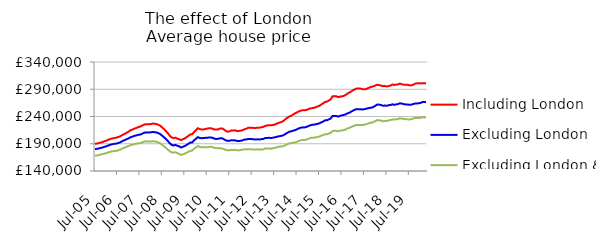
| Category | Including London | Excluding London | Excluding London & SE |
|---|---|---|---|
| 2005-07-01 | 190099.846 | 180338.943 | 168115.943 |
| 2005-08-01 | 190409.416 | 180707.116 | 168387.745 |
| 2005-09-01 | 191025.705 | 181294.079 | 169165.237 |
| 2005-10-01 | 192128.229 | 182260.003 | 170136.846 |
| 2005-11-01 | 193022.749 | 183020.557 | 170802.395 |
| 2005-12-01 | 194589.472 | 184321.051 | 171890.78 |
| 2006-01-01 | 195561.889 | 185223.855 | 172601.05 |
| 2006-02-01 | 197180.233 | 186694.526 | 173973.307 |
| 2006-03-01 | 198290.018 | 187883.534 | 175074.67 |
| 2006-04-01 | 199521.21 | 188954.872 | 175987.174 |
| 2006-05-01 | 200291.878 | 189620.06 | 176437.969 |
| 2006-06-01 | 200874.24 | 190048.53 | 176847.591 |
| 2006-07-01 | 201753.772 | 190830.896 | 177451.803 |
| 2006-08-01 | 202945.476 | 191932.237 | 178625.067 |
| 2006-09-01 | 204665.909 | 193486.107 | 180029.257 |
| 2006-10-01 | 206669.853 | 195431.198 | 181917.714 |
| 2006-11-01 | 208271.992 | 196704.296 | 182996.889 |
| 2006-12-01 | 210431.706 | 198484.218 | 184628.33 |
| 2007-01-01 | 212236.573 | 199867.99 | 185753.039 |
| 2007-02-01 | 214691.924 | 201953.448 | 187491.53 |
| 2007-03-01 | 215960.598 | 202950.014 | 188129.855 |
| 2007-04-01 | 217668.208 | 204390.327 | 189305.612 |
| 2007-05-01 | 218745.526 | 205176.529 | 190051.523 |
| 2007-06-01 | 220436.757 | 206350.676 | 190766.928 |
| 2007-07-01 | 221128.98 | 206601.586 | 190934.336 |
| 2007-08-01 | 222903.284 | 208023.687 | 191970.933 |
| 2007-09-01 | 224639.27 | 209648.69 | 193488.751 |
| 2007-10-01 | 225909.983 | 210886.574 | 194554.085 |
| 2007-11-01 | 225637.65 | 210701.658 | 194139.319 |
| 2007-12-01 | 225795.991 | 210808.016 | 194100.151 |
| 2008-01-01 | 226230.744 | 210997.948 | 193849.067 |
| 2008-02-01 | 227150.677 | 211685.752 | 194629.825 |
| 2008-03-01 | 226536.237 | 211131.036 | 194027.854 |
| 2008-04-01 | 226088.749 | 210687.499 | 193735.581 |
| 2008-05-01 | 224583.894 | 209243.33 | 192031.653 |
| 2008-06-01 | 222870.934 | 207605.676 | 190599.84 |
| 2008-07-01 | 219624.904 | 204552.197 | 187738.181 |
| 2008-08-01 | 216697.269 | 201783.679 | 185273.991 |
| 2008-09-01 | 213087.292 | 198550.708 | 182220.184 |
| 2008-10-01 | 209193.305 | 194954.131 | 179292.765 |
| 2008-11-01 | 204692.274 | 190946.059 | 176189.96 |
| 2008-12-01 | 201599.231 | 187849.92 | 174117.242 |
| 2009-01-01 | 200403.32 | 186878.072 | 173689.928 |
| 2009-02-01 | 201116.809 | 187902.199 | 174505.275 |
| 2009-03-01 | 199383.582 | 186328.236 | 172948.571 |
| 2009-04-01 | 198315.606 | 185259.882 | 171374.665 |
| 2009-05-01 | 196756.715 | 183093.397 | 169466.686 |
| 2009-06-01 | 198255.489 | 184493.743 | 170575.472 |
| 2009-07-01 | 199781.16 | 185725.435 | 171866.354 |
| 2009-08-01 | 202057.625 | 187894.019 | 173683.287 |
| 2009-09-01 | 204651.712 | 189897.228 | 175272.485 |
| 2009-10-01 | 206995.738 | 192147.604 | 177124.978 |
| 2009-11-01 | 207417.779 | 192401.732 | 177434.262 |
| 2009-12-01 | 211553.202 | 196348.095 | 180850.865 |
| 2010-01-01 | 214802.067 | 199095.743 | 183197.337 |
| 2010-02-01 | 218402.314 | 202123.005 | 185706.212 |
| 2010-03-01 | 216980.15 | 200671.83 | 184170.446 |
| 2010-04-01 | 216236.552 | 200161.69 | 183628.078 |
| 2010-05-01 | 216342.245 | 200449.238 | 183492.691 |
| 2010-06-01 | 217108.95 | 200783.748 | 183659.372 |
| 2010-07-01 | 217722.397 | 201016.807 | 183577.266 |
| 2010-08-01 | 218424.805 | 201510.881 | 184095.582 |
| 2010-09-01 | 218322.566 | 201613.716 | 184429.571 |
| 2010-10-01 | 217469.066 | 200750.626 | 183714.847 |
| 2010-11-01 | 215945.135 | 199049.754 | 182199.609 |
| 2010-12-01 | 216018.582 | 198791.843 | 181915.72 |
| 2011-01-01 | 216546.568 | 199114.513 | 181707.335 |
| 2011-02-01 | 218068.153 | 200152.075 | 182069.043 |
| 2011-03-01 | 218196.649 | 199966.213 | 181215.956 |
| 2011-04-01 | 216131.402 | 198173.837 | 180210.582 |
| 2011-05-01 | 213449.47 | 196231.995 | 178717.115 |
| 2011-06-01 | 211977.123 | 195154.451 | 177946.276 |
| 2011-07-01 | 212947.067 | 195568.747 | 178041.865 |
| 2011-08-01 | 214410.19 | 196445.281 | 178684.615 |
| 2011-09-01 | 214360.747 | 196165.982 | 178661.749 |
| 2011-10-01 | 214614.218 | 196213.259 | 178936.575 |
| 2011-11-01 | 213368.423 | 194966.866 | 177953.868 |
| 2011-12-01 | 213453.491 | 194865.197 | 178125.881 |
| 2012-01-01 | 214164.256 | 195514.42 | 178545.093 |
| 2012-02-01 | 214959.421 | 196404.975 | 179356.541 |
| 2012-03-01 | 216756.933 | 197817.955 | 179833.607 |
| 2012-04-01 | 217525.251 | 197898.314 | 179527.6 |
| 2012-05-01 | 219534.588 | 198949.536 | 180120.689 |
| 2012-06-01 | 219513.993 | 198774.052 | 180105.596 |
| 2012-07-01 | 219293.182 | 198462.317 | 179541.287 |
| 2012-08-01 | 218806.749 | 198165.774 | 179441.589 |
| 2012-09-01 | 219040.471 | 197834.003 | 179242.398 |
| 2012-10-01 | 219439.904 | 198189.625 | 179878.203 |
| 2012-11-01 | 219547.943 | 197705.403 | 179149.824 |
| 2012-12-01 | 220234.493 | 198496.975 | 179579.951 |
| 2013-01-01 | 220907.865 | 198670.322 | 179702.72 |
| 2013-02-01 | 222701.635 | 200446.331 | 181549.7 |
| 2013-03-01 | 223469.687 | 200554.563 | 181214.051 |
| 2013-04-01 | 224076.303 | 200944.861 | 181537.119 |
| 2013-05-01 | 223921.625 | 200574.706 | 180786.657 |
| 2013-06-01 | 224267.124 | 200953.441 | 181634.225 |
| 2013-07-01 | 225135.999 | 201680.442 | 182212.686 |
| 2013-08-01 | 226546.907 | 202586.569 | 183374.231 |
| 2013-09-01 | 227936.906 | 203391.678 | 184304.363 |
| 2013-10-01 | 229322.843 | 204234.069 | 184859.274 |
| 2013-11-01 | 230315.56 | 204602.914 | 184983.348 |
| 2013-12-01 | 232460.97 | 206225.51 | 185922.887 |
| 2014-01-01 | 235647.935 | 208367.783 | 187801.311 |
| 2014-02-01 | 237927.871 | 210397.831 | 189383.724 |
| 2014-03-01 | 240195.48 | 212153.651 | 190765.188 |
| 2014-04-01 | 241469.41 | 212884.813 | 191208.257 |
| 2014-05-01 | 243828.789 | 214011.28 | 191911.354 |
| 2014-06-01 | 245878.968 | 214988.938 | 192449.329 |
| 2014-07-01 | 247539.081 | 216525.132 | 193508.231 |
| 2014-08-01 | 249418.581 | 218299.792 | 195238.949 |
| 2014-09-01 | 250747.668 | 219267.162 | 196217.978 |
| 2014-10-01 | 251554.885 | 220056.663 | 197190.317 |
| 2014-11-01 | 251534.53 | 220011.241 | 196854.96 |
| 2014-12-01 | 251925.861 | 220856.382 | 197709.619 |
| 2015-01-01 | 253431.809 | 222218.445 | 198798.752 |
| 2015-02-01 | 254648.094 | 223740.73 | 200411.959 |
| 2015-03-01 | 255340.043 | 224687.291 | 201074.597 |
| 2015-04-01 | 255876.646 | 224953.264 | 201223.329 |
| 2015-05-01 | 257025.996 | 225743.668 | 201647.303 |
| 2015-06-01 | 258406.622 | 226541.496 | 202357.934 |
| 2015-07-01 | 259602.635 | 227594.255 | 203220.157 |
| 2015-08-01 | 262060.066 | 229279.729 | 204864.029 |
| 2015-09-01 | 264071.331 | 230781.509 | 205875.688 |
| 2015-10-01 | 266782.334 | 232880.229 | 207519.819 |
| 2015-11-01 | 267291.861 | 233078.556 | 207401.625 |
| 2015-12-01 | 269274.759 | 234653.062 | 208682.249 |
| 2016-01-01 | 271443.4 | 236250.053 | 209960.366 |
| 2016-02-01 | 277004.369 | 240964.363 | 213565.188 |
| 2016-03-01 | 277389.465 | 241069.016 | 213647.835 |
| 2016-04-01 | 277297.091 | 241113.692 | 213747.829 |
| 2016-05-01 | 275418.62 | 239697.966 | 212715.74 |
| 2016-06-01 | 276421.502 | 241310.921 | 214050.192 |
| 2016-07-01 | 276889.319 | 242056.992 | 214467.794 |
| 2016-08-01 | 277720.279 | 242891.392 | 215117.975 |
| 2016-09-01 | 279478.836 | 243807.73 | 215967.563 |
| 2016-10-01 | 282129.038 | 245841.601 | 218145.007 |
| 2016-11-01 | 283867.789 | 246937.83 | 219176.651 |
| 2016-12-01 | 285994.373 | 248943.025 | 220801.556 |
| 2017-01-01 | 288305.174 | 250939.187 | 222234.01 |
| 2017-02-01 | 290047.786 | 252664.53 | 223665.666 |
| 2017-03-01 | 291500.755 | 253648.484 | 224617.928 |
| 2017-04-01 | 291264.163 | 253147.959 | 224186.554 |
| 2017-05-01 | 291153.386 | 253193.423 | 224375.022 |
| 2017-06-01 | 290026.535 | 252897.924 | 224334.818 |
| 2017-07-01 | 289885.181 | 253387.675 | 224923.239 |
| 2017-08-01 | 290351.528 | 254209.469 | 225867.267 |
| 2017-09-01 | 292184.806 | 255170.845 | 227087.971 |
| 2017-10-01 | 293542.539 | 255913.818 | 228216.141 |
| 2017-11-01 | 294658.844 | 256267.421 | 228814.007 |
| 2017-12-01 | 295560.962 | 257834.073 | 230059.837 |
| 2018-01-01 | 297174.388 | 260013.605 | 231751.663 |
| 2018-02-01 | 298313.44 | 262036.077 | 233468.14 |
| 2018-03-01 | 297460.703 | 261701.24 | 233051.072 |
| 2018-04-01 | 296660.349 | 261063.081 | 232359.108 |
| 2018-05-01 | 295704.696 | 259681.755 | 231217.99 |
| 2018-06-01 | 296136.927 | 260172.462 | 231919.124 |
| 2018-07-01 | 295042.264 | 259596.91 | 231731.04 |
| 2018-08-01 | 295883.669 | 260772.254 | 232991.887 |
| 2018-09-01 | 296762.15 | 261122.803 | 233452.043 |
| 2018-10-01 | 298734.437 | 262365.668 | 234840.094 |
| 2018-11-01 | 297922.604 | 261492.642 | 234166.854 |
| 2018-12-01 | 298476.442 | 262137.492 | 234975.062 |
| 2019-01-01 | 299007.371 | 262793.695 | 235324.207 |
| 2019-02-01 | 300296.096 | 264248.926 | 236671.503 |
| 2019-03-01 | 299241.98 | 263640.532 | 236119.298 |
| 2019-04-01 | 298500.906 | 262770.126 | 235711.382 |
| 2019-05-01 | 298354.748 | 262078.862 | 235158.226 |
| 2019-06-01 | 298327.607 | 261892.75 | 234761.212 |
| 2019-07-01 | 297294.31 | 261687.558 | 234632.832 |
| 2019-08-01 | 296954.896 | 261776.846 | 234958.226 |
| 2019-09-01 | 298124.388 | 262597.314 | 236198.096 |
| 2019-10-01 | 300044.888 | 263670.151 | 237248.494 |
| 2019-11-01 | 300830.748 | 263823.934 | 237116.114 |
| 2019-12-01 | 301113.507 | 264334.122 | 237308.334 |
| 2020-01-01 | 300626.774 | 264701.27 | 237343.461 |
| 2020-02-01 | 301243.459 | 266478.082 | 238914.004 |
| 2020-03-01 | 300819.281 | 266488.773 | 238243.332 |
| 2020-04-01 | 301270.184 | 266847.259 | 237894.283 |